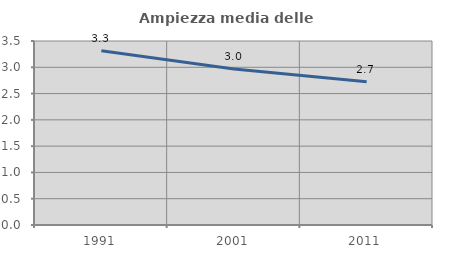
| Category | Ampiezza media delle famiglie |
|---|---|
| 1991.0 | 3.315 |
| 2001.0 | 2.966 |
| 2011.0 | 2.726 |